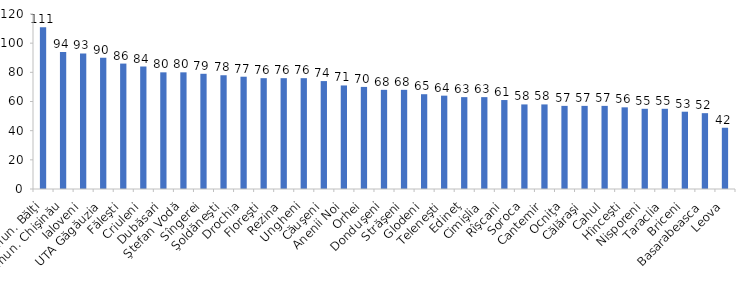
| Category | Series 0 |
|---|---|
| mun. Bălţi | 111 |
| mun. Chişinău | 94 |
| Ialoveni | 93 |
| UTA Găgăuzia | 90 |
| Făleşti | 86 |
| Criuleni | 84 |
| Dubăsari | 80 |
| Ştefan Vodă | 80 |
| Sîngerei | 79 |
| Şoldăneşti | 78 |
| Drochia | 77 |
| Floreşti | 76 |
| Rezina | 76 |
| Ungheni | 76 |
| Căuşeni | 74 |
| Anenii Noi | 71 |
| Orhei | 70 |
| Donduşeni | 68 |
| Străşeni | 68 |
| Glodeni | 65 |
| Teleneşti | 64 |
| Edineţ | 63 |
| Cimişlia | 63 |
| Rîşcani | 61 |
| Soroca | 58 |
| Cantemir | 58 |
| Ocniţa | 57 |
| Călăraşi | 57 |
| Cahul | 57 |
| Hînceşti | 56 |
| Nisporeni | 55 |
| Taraclia | 55 |
| Briceni | 53 |
| Basarabeasca | 52 |
| Leova | 42 |